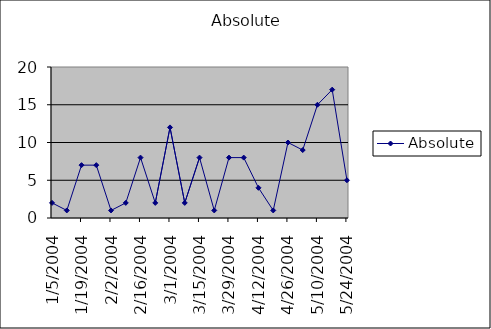
| Category | Absolute |
|---|---|
| 1/5/04 | 2 |
| 1/12/04 | 1 |
| 1/19/04 | 7 |
| 1/26/04 | 7 |
| 2/2/04 | 1 |
| 2/9/04 | 2 |
| 2/16/04 | 8 |
| 2/23/04 | 2 |
| 3/1/04 | 12 |
| 3/8/04 | 2 |
| 3/15/04 | 8 |
| 3/22/04 | 1 |
| 3/29/04 | 8 |
| 4/5/04 | 8 |
| 4/12/04 | 4 |
| 4/19/04 | 1 |
| 4/26/04 | 10 |
| 5/3/04 | 9 |
| 5/10/04 | 15 |
| 5/17/04 | 17 |
| 5/24/04 | 5 |